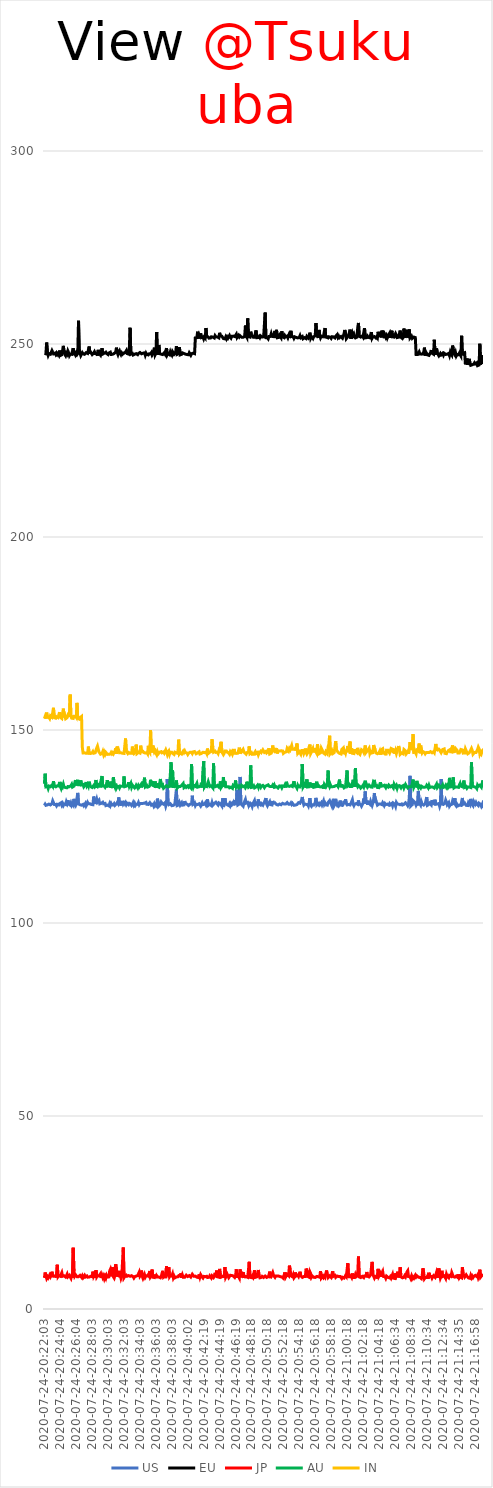
| Category | US | EU | JP | AU | IN |
|---|---|---|---|---|---|
| 2020-07-24-20:22:03 | 130.45 | 247.544 | 8.046 | 136.082 | 152.96 |
| 2020-07-24-20:22:09 | 130.794 | 247.653 | 9.466 | 138.687 | 153.498 |
| 2020-07-24-20:22:15 | 130.482 | 247.477 | 9.257 | 135.281 | 152.974 |
| 2020-07-24-20:22:21 | 130.434 | 250.376 | 7.977 | 135.175 | 154.494 |
| 2020-07-24-20:22:26 | 130.6 | 247.848 | 8.385 | 135.398 | 153.332 |
| 2020-07-24-20:22:32 | 130.545 | 247.07 | 8.054 | 134.846 | 153.342 |
| 2020-07-24-20:22:38 | 130.793 | 247.535 | 7.897 | 135.48 | 153.27 |
| 2020-07-24-20:22:43 | 130.999 | 247.503 | 8.808 | 135.39 | 152.961 |
| 2020-07-24-20:22:49 | 130.59 | 247.366 | 8.356 | 135.312 | 153.688 |
| 2020-07-24-20:22:55 | 130.654 | 247.162 | 8.757 | 135.444 | 153.873 |
| 2020-07-24-20:23:01 | 130.937 | 248.296 | 9.663 | 135.728 | 153.326 |
| 2020-07-24-20:23:07 | 131.642 | 248.53 | 8.518 | 135.416 | 153.415 |
| 2020-07-24-20:23:12 | 131.767 | 247.45 | 8.529 | 136.731 | 155.751 |
| 2020-07-24-20:23:18 | 130.731 | 247.396 | 8.461 | 135.46 | 153.223 |
| 2020-07-24-20:23:24 | 130.9 | 247.629 | 8.243 | 135.255 | 153.34 |
| 2020-07-24-20:23:29 | 130.73 | 247.267 | 8.695 | 135.271 | 153.058 |
| 2020-07-24-20:23:35 | 130.365 | 247.643 | 8.155 | 135.227 | 153.455 |
| 2020-07-24-20:23:41 | 130.744 | 247.259 | 11.451 | 135.535 | 153.559 |
| 2020-07-24-20:23:47 | 130.911 | 247.545 | 8.371 | 135.378 | 153.222 |
| 2020-07-24-20:23:52 | 130.584 | 247.187 | 8.642 | 135.515 | 153.409 |
| 2020-07-24-20:23:58 | 130.917 | 248.306 | 8.587 | 136.554 | 154.625 |
| 2020-07-24-20:24:04 | 130.674 | 247.009 | 8.482 | 135.351 | 153.306 |
| 2020-07-24-20:24:09 | 131.148 | 247.091 | 8.41 | 134.888 | 153.35 |
| 2020-07-24-20:24:15 | 130.566 | 247.195 | 9.402 | 135.666 | 152.978 |
| 2020-07-24-20:24:21 | 130.967 | 247.052 | 8.478 | 135.29 | 153.183 |
| 2020-07-24-20:24:27 | 130.459 | 249.525 | 8.388 | 135.946 | 155.537 |
| 2020-07-24-20:24:32 | 130.834 | 247.858 | 8.593 | 135.222 | 153.277 |
| 2020-07-24-20:24:38 | 131.012 | 247.293 | 8.628 | 135.447 | 153.751 |
| 2020-07-24-20:24:44 | 130.687 | 246.969 | 8.278 | 135.074 | 152.912 |
| 2020-07-24-20:24:49 | 131.462 | 247.597 | 8.588 | 135.202 | 153.109 |
| 2020-07-24-20:24:55 | 131.015 | 247.326 | 9.019 | 135.045 | 153.197 |
| 2020-07-24-20:25:01 | 131.812 | 248.2 | 8.337 | 135.35 | 153.228 |
| 2020-07-24-20:25:07 | 130.837 | 247.76 | 8.472 | 135.342 | 154.475 |
| 2020-07-24-20:25:12 | 131.079 | 247.012 | 8.739 | 135.314 | 153.372 |
| 2020-07-24-20:25:18 | 130.542 | 247.362 | 8.322 | 135.529 | 159.164 |
| 2020-07-24-20:25:24 | 131.096 | 247.171 | 7.972 | 135.574 | 153.476 |
| 2020-07-24-20:25:29 | 130.529 | 247.318 | 8.915 | 135.913 | 153.063 |
| 2020-07-24-20:25:35 | 130.935 | 247.474 | 8.077 | 135.211 | 152.885 |
| 2020-07-24-20:25:41 | 130.612 | 248.923 | 15.854 | 135.371 | 152.992 |
| 2020-07-24-20:25:47 | 132.159 | 247.101 | 9.749 | 135.457 | 153.55 |
| 2020-07-24-20:25:52 | 130.658 | 247.69 | 8.555 | 135.486 | 153.359 |
| 2020-07-24-20:25:58 | 130.386 | 247.212 | 8.889 | 137.017 | 153.585 |
| 2020-07-24-20:26:04 | 130.875 | 247.636 | 8.98 | 135.625 | 153.291 |
| 2020-07-24-20:26:09 | 130.653 | 247.26 | 8.366 | 135.737 | 157.026 |
| 2020-07-24-20:26:15 | 133.706 | 247.562 | 8.559 | 137.086 | 153.013 |
| 2020-07-24-20:26:21 | 130.823 | 256.018 | 8.378 | 135.812 | 153.148 |
| 2020-07-24-20:26:27 | 130.83 | 247.353 | 8.469 | 135.624 | 152.823 |
| 2020-07-24-20:26:32 | 130.633 | 247.714 | 8.706 | 135.813 | 153.206 |
| 2020-07-24-20:26:38 | 130.764 | 247.01 | 8.484 | 136.954 | 153.221 |
| 2020-07-24-20:26:44 | 130.527 | 247.227 | 8.214 | 135.779 | 153.518 |
| 2020-07-24-20:26:49 | 130.766 | 247.754 | 8.607 | 135.649 | 145.563 |
| 2020-07-24-20:26:55 | 130.734 | 247.466 | 8.118 | 135.87 | 144.061 |
| 2020-07-24-20:27:01 | 130.372 | 247.337 | 8.273 | 135.279 | 143.956 |
| 2020-07-24-20:27:06 | 130.569 | 247.334 | 8.718 | 135.334 | 144.096 |
| 2020-07-24-20:27:12 | 130.977 | 247.381 | 8.304 | 135.767 | 144.252 |
| 2020-07-24-20:27:18 | 130.338 | 247.734 | 8.454 | 136.522 | 143.958 |
| 2020-07-24-20:27:24 | 130.693 | 247.701 | 8.561 | 135.595 | 144.135 |
| 2020-07-24-20:27:29 | 131.234 | 247.552 | 8.254 | 135.957 | 144.004 |
| 2020-07-24-20:27:35 | 130.869 | 247.59 | 8.4 | 135.492 | 145.704 |
| 2020-07-24-20:27:41 | 130.805 | 249.348 | 8.263 | 136.608 | 143.969 |
| 2020-07-24-20:27:46 | 130.89 | 247.447 | 8.296 | 135.796 | 144.058 |
| 2020-07-24-20:27:52 | 130.997 | 247.902 | 8.483 | 135.345 | 143.904 |
| 2020-07-24-20:27:58 | 130.706 | 247.673 | 8.589 | 135.414 | 144.125 |
| 2020-07-24-20:28:03 | 130.919 | 247.275 | 8.374 | 135.111 | 144.097 |
| 2020-07-24-20:28:09 | 130.644 | 247.337 | 9.681 | 135.353 | 144.425 |
| 2020-07-24-20:28:15 | 132.769 | 247.662 | 8.439 | 135.629 | 143.985 |
| 2020-07-24-20:28:21 | 131.916 | 247.994 | 8.822 | 135.287 | 144.048 |
| 2020-07-24-20:28:26 | 130.849 | 247.512 | 8.053 | 135.58 | 144.1 |
| 2020-07-24-20:28:32 | 131.104 | 247.584 | 10.041 | 137.052 | 144.336 |
| 2020-07-24-20:28:38 | 132.117 | 247.466 | 8.331 | 134.958 | 145.364 |
| 2020-07-24-20:28:43 | 131.317 | 246.984 | 8.668 | 135.479 | 145.833 |
| 2020-07-24-20:28:49 | 131.347 | 248.48 | 8.461 | 135.884 | 146.029 |
| 2020-07-24-20:28:55 | 131.803 | 247.603 | 8.554 | 135.631 | 144.302 |
| 2020-07-24-20:29:00 | 130.863 | 247.351 | 8.486 | 136.072 | 144.062 |
| 2020-07-24-20:29:06 | 130.654 | 247.106 | 9.129 | 135.137 | 143.734 |
| 2020-07-24-20:29:12 | 130.999 | 247.194 | 8.033 | 137.17 | 143.98 |
| 2020-07-24-20:29:18 | 131.162 | 248.906 | 8.696 | 138.084 | 143.92 |
| 2020-07-24-20:29:23 | 131.283 | 247.406 | 8.149 | 135.465 | 144.425 |
| 2020-07-24-20:29:29 | 130.893 | 247.589 | 8.567 | 135.346 | 143.671 |
| 2020-07-24-20:29:35 | 130.773 | 247.623 | 7.876 | 135.459 | 144.221 |
| 2020-07-24-20:29:40 | 130.988 | 247.602 | 8.437 | 135.173 | 143.703 |
| 2020-07-24-20:29:46 | 130.407 | 247.889 | 7.982 | 135.561 | 144.2 |
| 2020-07-24-20:29:52 | 130.491 | 247.543 | 8.681 | 135.101 | 144.126 |
| 2020-07-24-20:29:58 | 130.541 | 247.545 | 8.269 | 137.007 | 143.684 |
| 2020-07-24-20:30:03 | 130.641 | 247.261 | 8.159 | 135.526 | 143.854 |
| 2020-07-24-20:30:09 | 130.342 | 247.662 | 8.312 | 135.546 | 143.699 |
| 2020-07-24-20:30:15 | 130.908 | 247.772 | 9.824 | 135.448 | 143.788 |
| 2020-07-24-20:30:20 | 130.438 | 247.878 | 10.272 | 136.63 | 143.787 |
| 2020-07-24-20:30:26 | 130.954 | 247.288 | 9.27 | 135.019 | 144.168 |
| 2020-07-24-20:30:32 | 130.601 | 247.136 | 8.47 | 135.482 | 143.845 |
| 2020-07-24-20:30:37 | 130.469 | 247.334 | 10.892 | 134.991 | 144.111 |
| 2020-07-24-20:30:43 | 130.595 | 247.156 | 8.333 | 137.753 | 143.804 |
| 2020-07-24-20:30:49 | 130.895 | 247.559 | 8.022 | 135.814 | 144.154 |
| 2020-07-24-20:30:55 | 130.475 | 247.581 | 8.791 | 135.296 | 144.467 |
| 2020-07-24-20:31:00 | 130.364 | 247.915 | 11.63 | 136.104 | 145.269 |
| 2020-07-24-20:31:06 | 130.89 | 249.051 | 10.338 | 134.951 | 143.8 |
| 2020-07-24-20:31:12 | 131.193 | 247.809 | 8.377 | 135.336 | 145.71 |
| 2020-07-24-20:31:17 | 130.921 | 247.28 | 8.47 | 135.221 | 144.202 |
| 2020-07-24-20:31:23 | 132.555 | 247.891 | 9.881 | 135.394 | 144.728 |
| 2020-07-24-20:31:29 | 131.078 | 248.229 | 8.243 | 135.014 | 144.088 |
| 2020-07-24-20:31:34 | 130.697 | 247.611 | 8.796 | 135.488 | 143.986 |
| 2020-07-24-20:31:40 | 130.534 | 247.242 | 7.936 | 135.283 | 144.102 |
| 2020-07-24-20:31:46 | 130.734 | 247.664 | 8.485 | 135.413 | 144.096 |
| 2020-07-24-20:31:52 | 131.643 | 247.328 | 8.459 | 135.391 | 143.962 |
| 2020-07-24-20:31:57 | 130.832 | 247.208 | 15.941 | 135.404 | 143.828 |
| 2020-07-24-20:32:03 | 131.15 | 247.674 | 8.122 | 137.977 | 143.934 |
| 2020-07-24-20:32:09 | 130.859 | 247.624 | 8.439 | 135.328 | 143.967 |
| 2020-07-24-20:32:14 | 131.197 | 247.917 | 8.206 | 135.493 | 147.792 |
| 2020-07-24-20:32:20 | 130.67 | 248.261 | 8.76 | 135.447 | 144.493 |
| 2020-07-24-20:32:26 | 131.005 | 247.517 | 8.483 | 135.515 | 144.454 |
| 2020-07-24-20:32:32 | 130.938 | 247.75 | 8.414 | 135.641 | 143.912 |
| 2020-07-24-20:32:37 | 130.643 | 247.382 | 8.653 | 136.468 | 144.178 |
| 2020-07-24-20:32:43 | 130.995 | 249.034 | 8.664 | 135.416 | 144.115 |
| 2020-07-24-20:32:49 | 130.974 | 254.189 | 8.477 | 135.225 | 143.945 |
| 2020-07-24-20:32:54 | 130.805 | 247.361 | 8.455 | 136.217 | 143.762 |
| 2020-07-24-20:33:00 | 130.467 | 247.288 | 8.63 | 135.237 | 143.98 |
| 2020-07-24-20:33:06 | 130.735 | 247.568 | 8.484 | 135.732 | 145.705 |
| 2020-07-24-20:33:12 | 131.169 | 247.145 | 8.372 | 135.461 | 144.217 |
| 2020-07-24-20:33:17 | 130.582 | 247.386 | 8.036 | 135.362 | 143.878 |
| 2020-07-24-20:33:23 | 131.007 | 247.358 | 8.358 | 135.007 | 143.744 |
| 2020-07-24-20:33:29 | 130.501 | 247.594 | 8.107 | 135.28 | 144.286 |
| 2020-07-24-20:33:34 | 130.794 | 247.503 | 8.525 | 135.695 | 146.215 |
| 2020-07-24-20:33:40 | 130.894 | 247.344 | 8.312 | 135.485 | 143.884 |
| 2020-07-24-20:33:46 | 130.733 | 247.24 | 8.651 | 135.019 | 144.064 |
| 2020-07-24-20:33:51 | 131.202 | 247.543 | 8.44 | 135.586 | 144.221 |
| 2020-07-24-20:33:57 | 130.657 | 247.437 | 9.535 | 135.223 | 144.064 |
| 2020-07-24-20:34:03 | 130.964 | 247.797 | 8.486 | 135.427 | 144.019 |
| 2020-07-24-20:34:09 | 131.034 | 248.053 | 8.754 | 135.778 | 145.948 |
| 2020-07-24-20:34:14 | 130.931 | 247.463 | 9.959 | 135.116 | 144.37 |
| 2020-07-24-20:34:20 | 130.996 | 247.245 | 8.479 | 135.977 | 144.228 |
| 2020-07-24-20:34:26 | 130.983 | 247.629 | 7.945 | 136.656 | 144.454 |
| 2020-07-24-20:34:31 | 130.84 | 247.464 | 8.396 | 135.418 | 144.172 |
| 2020-07-24-20:34:37 | 131.042 | 247.712 | 8.912 | 137.637 | 144.168 |
| 2020-07-24-20:34:43 | 131.022 | 247.091 | 8.249 | 135.292 | 144.032 |
| 2020-07-24-20:34:49 | 131.23 | 247.639 | 8.608 | 135.517 | 144.266 |
| 2020-07-24-20:34:54 | 130.737 | 247.299 | 8.39 | 135.637 | 144.154 |
| 2020-07-24-20:35:00 | 130.528 | 247.479 | 8.542 | 135.213 | 143.844 |
| 2020-07-24-20:35:06 | 130.729 | 247.178 | 8.881 | 135.227 | 145.918 |
| 2020-07-24-20:35:11 | 130.824 | 247.447 | 8.55 | 135.347 | 144.45 |
| 2020-07-24-20:35:17 | 131.186 | 247.448 | 9.867 | 135.629 | 144.167 |
| 2020-07-24-20:35:23 | 130.925 | 247.474 | 8.368 | 137.098 | 149.918 |
| 2020-07-24-20:35:28 | 130.522 | 247.758 | 8.68 | 135.677 | 144.197 |
| 2020-07-24-20:35:34 | 130.77 | 247.127 | 10.228 | 136.756 | 144.288 |
| 2020-07-24-20:35:40 | 130.762 | 247.442 | 8.234 | 135.648 | 145.967 |
| 2020-07-24-20:35:46 | 130.339 | 247.209 | 8.374 | 135.534 | 145.234 |
| 2020-07-24-20:35:51 | 130.861 | 249.034 | 8.157 | 135.458 | 144.332 |
| 2020-07-24-20:35:57 | 130.382 | 247.192 | 8.939 | 136.689 | 144.617 |
| 2020-07-24-20:36:03 | 130.644 | 247.601 | 8.007 | 135.062 | 143.988 |
| 2020-07-24-20:36:08 | 130.367 | 253.116 | 8.648 | 136.215 | 143.598 |
| 2020-07-24-20:36:14 | 132.222 | 247.247 | 8.356 | 135.399 | 144.341 |
| 2020-07-24-20:36:20 | 132.001 | 248.797 | 8.503 | 135.644 | 143.796 |
| 2020-07-24-20:36:26 | 130.299 | 249.755 | 8.271 | 135.198 | 143.843 |
| 2020-07-24-20:36:31 | 130.556 | 247.49 | 8.504 | 135.155 | 144.251 |
| 2020-07-24-20:36:37 | 130.716 | 247.61 | 8.077 | 137.313 | 144.443 |
| 2020-07-24-20:36:43 | 131.336 | 247.369 | 8.398 | 135.174 | 144.387 |
| 2020-07-24-20:36:48 | 131.062 | 247.374 | 8.449 | 136.293 | 144.1 |
| 2020-07-24-20:36:54 | 131.16 | 247.268 | 9.897 | 135.426 | 144.331 |
| 2020-07-24-20:37:00 | 130.789 | 247.067 | 8.292 | 134.917 | 144.302 |
| 2020-07-24-20:37:06 | 130.75 | 247.727 | 8.518 | 134.955 | 143.999 |
| 2020-07-24-20:37:11 | 131.145 | 247.395 | 8.661 | 135.287 | 143.837 |
| 2020-07-24-20:37:17 | 130.273 | 247.597 | 7.991 | 135.264 | 144.856 |
| 2020-07-24-20:37:23 | 130.894 | 248.933 | 11.108 | 135.581 | 144.315 |
| 2020-07-24-20:37:28 | 137.302 | 247.206 | 8.502 | 135.58 | 143.672 |
| 2020-07-24-20:37:34 | 130.973 | 247.565 | 8.302 | 135.236 | 144.279 |
| 2020-07-24-20:37:40 | 130.65 | 247.65 | 10.848 | 135.037 | 144.571 |
| 2020-07-24-20:37:46 | 130.528 | 247.245 | 8.356 | 135.425 | 143.705 |
| 2020-07-24-20:37:51 | 130.906 | 247.949 | 8.639 | 135.684 | 144.256 |
| 2020-07-24-20:37:57 | 130.656 | 247.426 | 8.593 | 141.63 | 144.38 |
| 2020-07-24-20:38:03 | 130.392 | 247.118 | 8.549 | 135.186 | 144.222 |
| 2020-07-24-20:38:08 | 130.419 | 248.009 | 9.095 | 139.521 | 143.961 |
| 2020-07-24-20:38:14 | 130.479 | 247.689 | 8.091 | 135.03 | 143.894 |
| 2020-07-24-20:38:20 | 130.641 | 247.322 | 8.512 | 135.563 | 143.671 |
| 2020-07-24-20:38:25 | 130.79 | 247.193 | 8.075 | 135.906 | 144.256 |
| 2020-07-24-20:38:31 | 130.911 | 247.743 | 8.09 | 135.644 | 144.287 |
| 2020-07-24-20:38:37 | 134.582 | 249.423 | 8.291 | 136.932 | 144.085 |
| 2020-07-24-20:38:43 | 130.411 | 247.323 | 8.214 | 134.947 | 144.058 |
| 2020-07-24-20:38:48 | 130.645 | 247.179 | 8.349 | 135.065 | 143.933 |
| 2020-07-24-20:38:54 | 130.583 | 247.533 | 8.634 | 135.342 | 147.506 |
| 2020-07-24-20:39:00 | 131.162 | 249.192 | 8.71 | 135.466 | 143.844 |
| 2020-07-24-20:39:05 | 130.547 | 247.185 | 8.519 | 135.346 | 144.105 |
| 2020-07-24-20:39:11 | 130.499 | 247.321 | 9.252 | 135.176 | 143.898 |
| 2020-07-24-20:39:17 | 131.159 | 247.329 | 8.055 | 135.673 | 143.795 |
| 2020-07-24-20:39:22 | 130.527 | 247.705 | 8.786 | 135.514 | 144.232 |
| 2020-07-24-20:39:28 | 130.307 | 247.692 | 8.244 | 136.142 | 144.529 |
| 2020-07-24-20:39:34 | 130.598 | 247.531 | 8.114 | 135.094 | 144.174 |
| 2020-07-24-20:39:40 | 131.575 | 247.612 | 8.218 | 135.299 | 144.57 |
| 2020-07-24-20:39:45 | 130.943 | 247.376 | 8.228 | 135.447 | 144.157 |
| 2020-07-24-20:39:51 | 130.787 | 247.57 | 8.758 | 135.155 | 144.022 |
| 2020-07-24-20:39:57 | 130.801 | 247.265 | 8.53 | 135.165 | 144.031 |
| 2020-07-24-20:40:02 | 130.773 | 247.491 | 8.414 | 135.516 | 143.663 |
| 2020-07-24-20:40:08 | 130.449 | 247.221 | 8.328 | 135.223 | 143.968 |
| 2020-07-24-20:40:14 | 130.699 | 247.726 | 8.652 | 135.493 | 143.899 |
| 2020-07-24-20:40:20 | 130.789 | 247.5 | 8.756 | 135.386 | 144.227 |
| 2020-07-24-20:40:25 | 130.891 | 247.077 | 8.285 | 135.037 | 144.233 |
| 2020-07-24-20:40:31 | 130.805 | 247.49 | 8.166 | 141.168 | 144.231 |
| 2020-07-24-20:40:53 | 132.981 | 247.693 | 9.004 | 135.607 | 143.905 |
| 2020-07-24-20:40:59 | 130.792 | 247.623 | 8.896 | 135.083 | 144.325 |
| 2020-07-24-20:41:05 | 130.728 | 247.655 | 8.493 | 135.661 | 144.168 |
| 2020-07-24-20:41:10 | 131.143 | 247.496 | 8.417 | 135.452 | 144.421 |
| 2020-07-24-20:41:16 | 130.435 | 251.581 | 8.519 | 135.419 | 144.15 |
| 2020-07-24-20:41:22 | 130.797 | 251.611 | 8.34 | 135.262 | 143.839 |
| 2020-07-24-20:41:28 | 130.927 | 251.637 | 8.241 | 136.182 | 143.875 |
| 2020-07-24-20:41:33 | 130.682 | 253.19 | 8.356 | 135.193 | 144.084 |
| 2020-07-24-20:41:39 | 130.743 | 251.439 | 8.159 | 134.986 | 143.913 |
| 2020-07-24-20:41:45 | 130.883 | 252.236 | 8.973 | 135.298 | 144.364 |
| 2020-07-24-20:41:50 | 130.851 | 251.66 | 8.243 | 135.101 | 143.78 |
| 2020-07-24-20:41:56 | 130.307 | 252.733 | 8.891 | 135.481 | 143.628 |
| 2020-07-24-20:42:02 | 130.363 | 251.664 | 8.54 | 136.337 | 143.921 |
| 2020-07-24-20:42:08 | 131.136 | 251.64 | 8.513 | 135.115 | 144.094 |
| 2020-07-24-20:42:13 | 130.67 | 251.833 | 8.047 | 135.21 | 144.237 |
| 2020-07-24-20:42:19 | 130.532 | 251.325 | 8.448 | 141.913 | 144.029 |
| 2020-07-24-20:42:25 | 130.776 | 251.835 | 8.246 | 135.224 | 144.144 |
| 2020-07-24-20:42:30 | 131.073 | 251.571 | 8.367 | 135.538 | 143.905 |
| 2020-07-24-20:42:36 | 130.653 | 254.147 | 8.344 | 135.326 | 144.289 |
| 2020-07-24-20:42:42 | 130.775 | 251.981 | 8.466 | 135.362 | 143.885 |
| 2020-07-24-20:42:47 | 132.045 | 251.947 | 8.154 | 135.543 | 145.194 |
| 2020-07-24-20:42:53 | 130.471 | 251.8 | 8.409 | 136.617 | 143.917 |
| 2020-07-24-20:42:59 | 130.616 | 251.517 | 8.224 | 135.982 | 143.942 |
| 2020-07-24-20:43:05 | 130.757 | 251.473 | 8.592 | 135.365 | 144.242 |
| 2020-07-24-20:43:10 | 130.895 | 251.556 | 8.362 | 135.168 | 144.086 |
| 2020-07-24-20:43:16 | 130.433 | 251.861 | 8.049 | 135.535 | 144.463 |
| 2020-07-24-20:43:22 | 131.187 | 251.629 | 8.58 | 135.541 | 147.6 |
| 2020-07-24-20:43:27 | 130.522 | 251.78 | 8.559 | 135.033 | 145.419 |
| 2020-07-24-20:43:33 | 130.562 | 251.637 | 8.123 | 141.357 | 144.264 |
| 2020-07-24-20:43:39 | 130.961 | 251.557 | 8.413 | 135.242 | 144.302 |
| 2020-07-24-20:43:45 | 131.025 | 252.153 | 9.349 | 135.391 | 144.517 |
| 2020-07-24-20:43:50 | 131.287 | 251.868 | 8.264 | 135.364 | 144.204 |
| 2020-07-24-20:43:56 | 131.001 | 251.891 | 9.947 | 135.38 | 144.337 |
| 2020-07-24-20:44:02 | 130.776 | 251.82 | 8.349 | 135.634 | 144.216 |
| 2020-07-24-20:44:07 | 130.571 | 251.737 | 8.248 | 135.423 | 143.902 |
| 2020-07-24-20:44:13 | 131.122 | 251.594 | 8.241 | 135.214 | 144.593 |
| 2020-07-24-20:44:19 | 130.956 | 252.901 | 10.394 | 135.698 | 144.094 |
| 2020-07-24-20:44:24 | 130.884 | 252.061 | 8.723 | 136.696 | 143.843 |
| 2020-07-24-20:44:30 | 130.938 | 251.863 | 8.251 | 135.104 | 146.935 |
| 2020-07-24-20:44:36 | 130.297 | 252.008 | 8.337 | 135.295 | 144.3 |
| 2020-07-24-20:44:42 | 132.313 | 251.895 | 8.447 | 135.706 | 143.973 |
| 2020-07-24-20:44:47 | 130.093 | 251.401 | 8.27 | 137.826 | 143.624 |
| 2020-07-24-20:44:53 | 130.701 | 251.563 | 8.372 | 135.226 | 143.968 |
| 2020-07-24-20:44:59 | 132.356 | 251.327 | 10.881 | 136.693 | 144.573 |
| 2020-07-24-20:45:04 | 131.073 | 251.806 | 8.198 | 135.314 | 144.727 |
| 2020-07-24-20:45:10 | 130.895 | 251.362 | 8.571 | 135.388 | 144.551 |
| 2020-07-24-20:45:16 | 130.624 | 251.823 | 9.003 | 135.301 | 144.256 |
| 2020-07-24-20:45:22 | 130.737 | 251.52 | 9.135 | 135.546 | 144.162 |
| 2020-07-24-20:45:27 | 130.417 | 251.552 | 8.114 | 135.296 | 144.022 |
| 2020-07-24-20:45:33 | 130.863 | 252.21 | 8.22 | 135.023 | 143.735 |
| 2020-07-24-20:45:39 | 130.416 | 251.782 | 8.726 | 134.909 | 144.366 |
| 2020-07-24-20:45:44 | 130.943 | 251.521 | 8.513 | 135.202 | 144.041 |
| 2020-07-24-20:45:50 | 130.638 | 251.993 | 8.697 | 135.09 | 144.345 |
| 2020-07-24-20:45:56 | 130.733 | 251.839 | 8.448 | 134.889 | 143.765 |
| 2020-07-24-20:46:01 | 131.257 | 252.045 | 8.564 | 135.713 | 144.276 |
| 2020-07-24-20:46:07 | 130.472 | 251.879 | 8.339 | 135.888 | 145.093 |
| 2020-07-24-20:46:13 | 131.852 | 251.922 | 8.177 | 135.446 | 143.949 |
| 2020-07-24-20:46:19 | 131.903 | 252.115 | 8.541 | 136.932 | 143.869 |
| 2020-07-24-20:46:24 | 130.719 | 252.534 | 10.291 | 135.242 | 143.941 |
| 2020-07-24-20:46:30 | 134.531 | 251.673 | 8.105 | 135.521 | 144.056 |
| 2020-07-24-20:46:36 | 130.583 | 251.724 | 8.729 | 135.318 | 143.999 |
| 2020-07-24-20:46:41 | 130.595 | 252.234 | 8.684 | 135.035 | 143.976 |
| 2020-07-24-20:46:47 | 130.846 | 251.852 | 8.005 | 135.523 | 145.422 |
| 2020-07-24-20:46:53 | 137.85 | 252.127 | 10.267 | 135.589 | 143.898 |
| 2020-07-24-20:46:59 | 131.033 | 252.011 | 8.329 | 135.253 | 144.659 |
| 2020-07-24-20:47:04 | 130.664 | 251.752 | 9.639 | 135.675 | 144.364 |
| 2020-07-24-20:47:10 | 130.824 | 251.608 | 8.189 | 135.481 | 144.48 |
| 2020-07-24-20:47:16 | 130.255 | 251.751 | 9.529 | 135.315 | 144.962 |
| 2020-07-24-20:47:21 | 131.025 | 251.737 | 8.032 | 135.465 | 144.383 |
| 2020-07-24-20:47:27 | 130.97 | 251.932 | 8.552 | 135.529 | 144.088 |
| 2020-07-24-20:47:33 | 132.002 | 254.771 | 8.391 | 135.089 | 143.973 |
| 2020-07-24-20:47:38 | 131.068 | 252.064 | 8.377 | 135.46 | 143.74 |
| 2020-07-24-20:47:44 | 131.02 | 251.702 | 8.334 | 136.603 | 144.146 |
| 2020-07-24-20:47:50 | 131.231 | 256.642 | 8.207 | 135.624 | 144.02 |
| 2020-07-24-20:47:56 | 130.643 | 251.953 | 10.106 | 135.146 | 144.329 |
| 2020-07-24-20:48:01 | 131.394 | 251.873 | 12.222 | 135.304 | 145.757 |
| 2020-07-24-20:48:07 | 130.512 | 251.811 | 8.215 | 135.462 | 143.847 |
| 2020-07-24-20:48:13 | 130.596 | 253.182 | 8.298 | 140.835 | 143.96 |
| 2020-07-24-20:48:18 | 130.811 | 252.379 | 8.134 | 135.131 | 144.141 |
| 2020-07-24-20:48:24 | 130.217 | 252.214 | 8.529 | 135.146 | 143.692 |
| 2020-07-24-20:48:30 | 130.872 | 251.778 | 8.224 | 135.205 | 143.7 |
| 2020-07-24-20:48:36 | 130.717 | 251.928 | 8.157 | 135.496 | 143.712 |
| 2020-07-24-20:48:41 | 131.697 | 251.762 | 10.025 | 134.999 | 144.097 |
| 2020-07-24-20:48:47 | 130.705 | 252.009 | 8.199 | 135.226 | 144.399 |
| 2020-07-24-20:48:53 | 130.895 | 253.516 | 8.012 | 135.221 | 143.905 |
| 2020-07-24-20:48:58 | 131.063 | 251.632 | 8.317 | 135.262 | 144.002 |
| 2020-07-24-20:49:04 | 130.649 | 251.627 | 8.676 | 135.705 | 144.187 |
| 2020-07-24-20:49:10 | 132.024 | 251.675 | 10.109 | 135.227 | 143.574 |
| 2020-07-24-20:49:15 | 130.819 | 251.949 | 8.6 | 136.077 | 144.066 |
| 2020-07-24-20:49:21 | 130.814 | 251.642 | 8.081 | 135.353 | 143.879 |
| 2020-07-24-20:49:27 | 130.564 | 252.105 | 8.053 | 135.087 | 144.477 |
| 2020-07-24-20:49:33 | 130.956 | 251.883 | 8.193 | 135.451 | 144.203 |
| 2020-07-24-20:49:38 | 130.731 | 251.799 | 8.459 | 135.54 | 143.971 |
| 2020-07-24-20:49:44 | 130.544 | 251.861 | 8.279 | 135.64 | 144.859 |
| 2020-07-24-20:49:50 | 131.012 | 251.862 | 8.166 | 135.376 | 144.903 |
| 2020-07-24-20:49:55 | 131.285 | 252.062 | 8.425 | 135.08 | 144.188 |
| 2020-07-24-20:50:01 | 131.21 | 258.135 | 8.551 | 135.42 | 144.284 |
| 2020-07-24-20:50:07 | 132.357 | 251.643 | 8.753 | 135.305 | 144.467 |
| 2020-07-24-20:50:13 | 130.782 | 251.636 | 8.177 | 135.595 | 144.07 |
| 2020-07-24-20:50:18 | 130.374 | 251.62 | 8.301 | 135.795 | 144.234 |
| 2020-07-24-20:50:24 | 130.812 | 251.352 | 8.349 | 135.785 | 144.461 |
| 2020-07-24-20:50:30 | 130.935 | 251.97 | 8.751 | 135.482 | 145.301 |
| 2020-07-24-20:50:35 | 131.445 | 251.876 | 9.691 | 135.439 | 143.78 |
| 2020-07-24-20:50:41 | 130.674 | 251.974 | 7.994 | 135.336 | 143.976 |
| 2020-07-24-20:50:47 | 130.727 | 252.66 | 8.544 | 135.308 | 143.972 |
| 2020-07-24-20:50:53 | 130.581 | 251.97 | 8.379 | 135.368 | 144.381 |
| 2020-07-24-20:50:58 | 131.617 | 252.201 | 9.455 | 135.718 | 145.987 |
| 2020-07-24-20:51:04 | 131.028 | 251.917 | 8.789 | 135.398 | 144.267 |
| 2020-07-24-20:51:10 | 131.001 | 251.805 | 8.474 | 135.762 | 144.168 |
| 2020-07-24-20:51:15 | 131.124 | 253.404 | 8.207 | 135.192 | 145.349 |
| 2020-07-24-20:51:21 | 131.011 | 251.575 | 8.546 | 135.321 | 144.037 |
| 2020-07-24-20:51:27 | 130.701 | 253.667 | 8.38 | 135.317 | 145.299 |
| 2020-07-24-20:51:32 | 130.844 | 251.62 | 8.548 | 135.57 | 143.926 |
| 2020-07-24-20:51:38 | 130.56 | 251.771 | 8.592 | 134.974 | 144.6 |
| 2020-07-24-20:51:44 | 130.671 | 251.697 | 8.523 | 135.057 | 144.428 |
| 2020-07-24-20:51:50 | 130.821 | 252.257 | 8.549 | 135.522 | 144.546 |
| 2020-07-24-20:51:55 | 130.677 | 252.022 | 8.381 | 135.564 | 144.504 |
| 2020-07-24-20:52:01 | 130.639 | 251.64 | 8.22 | 135.467 | 144.607 |
| 2020-07-24-20:52:07 | 130.828 | 253.304 | 8.305 | 135.049 | 144.468 |
| 2020-07-24-20:52:12 | 131.005 | 251.858 | 8.343 | 135.51 | 144.582 |
| 2020-07-24-20:52:18 | 130.874 | 251.973 | 7.958 | 135.517 | 143.929 |
| 2020-07-24-20:52:24 | 130.822 | 251.645 | 8.046 | 135.401 | 143.864 |
| 2020-07-24-20:52:30 | 130.638 | 252.17 | 9.488 | 135.721 | 144.254 |
| 2020-07-24-20:52:35 | 130.807 | 251.842 | 8.264 | 135.1 | 144.486 |
| 2020-07-24-20:52:41 | 130.695 | 251.675 | 8.088 | 136.576 | 144.347 |
| 2020-07-24-20:52:47 | 131.205 | 252.056 | 8.976 | 135.823 | 145.231 |
| 2020-07-24-20:52:52 | 131.24 | 251.617 | 8.743 | 135.494 | 144.983 |
| 2020-07-24-20:52:58 | 130.765 | 252.166 | 8.603 | 135.383 | 144.592 |
| 2020-07-24-20:53:04 | 130.555 | 251.548 | 11.238 | 135.391 | 145.205 |
| 2020-07-24-20:53:09 | 130.793 | 251.791 | 10.209 | 135.584 | 144.882 |
| 2020-07-24-20:53:15 | 131.099 | 253.411 | 8.594 | 135.571 | 145.022 |
| 2020-07-24-20:53:21 | 130.725 | 251.911 | 8.671 | 135.335 | 145.973 |
| 2020-07-24-20:53:27 | 131.016 | 252.095 | 8.346 | 135.354 | 145.009 |
| 2020-07-24-20:53:32 | 130.934 | 251.9 | 8.867 | 135.103 | 144.992 |
| 2020-07-24-20:53:38 | 130.489 | 251.471 | 8.08 | 136.729 | 144.985 |
| 2020-07-24-20:53:44 | 130.718 | 251.845 | 8.365 | 135.538 | 144.978 |
| 2020-07-24-20:53:49 | 130.545 | 251.795 | 9.472 | 135.331 | 145.34 |
| 2020-07-24-20:53:55 | 130.375 | 251.683 | 8.567 | 135.299 | 144.666 |
| 2020-07-24-20:54:01 | 130.692 | 251.74 | 8.481 | 134.931 | 146.496 |
| 2020-07-24-20:54:07 | 130.674 | 251.575 | 8.746 | 135.666 | 143.938 |
| 2020-07-24-20:54:12 | 131.177 | 251.604 | 8.433 | 135.285 | 143.954 |
| 2020-07-24-20:54:18 | 130.986 | 251.725 | 8.223 | 135.439 | 144.395 |
| 2020-07-24-20:54:24 | 131.038 | 252.178 | 9.657 | 135.247 | 144.182 |
| 2020-07-24-20:54:29 | 131.159 | 251.621 | 8.582 | 135.722 | 143.723 |
| 2020-07-24-20:54:35 | 131.842 | 251.838 | 8.614 | 135.342 | 144.667 |
| 2020-07-24-20:54:41 | 132.644 | 251.926 | 8.186 | 141.192 | 144.779 |
| 2020-07-24-20:54:47 | 131.279 | 251.361 | 8.101 | 135.228 | 144.699 |
| 2020-07-24-20:54:52 | 130.601 | 251.436 | 8.4 | 135.38 | 143.937 |
| 2020-07-24-20:54:58 | 130.873 | 251.638 | 8.362 | 135.922 | 144.39 |
| 2020-07-24-20:55:04 | 130.877 | 251.697 | 8.423 | 136.496 | 145.208 |
| 2020-07-24-20:55:09 | 130.731 | 251.405 | 10.474 | 135.054 | 144.174 |
| 2020-07-24-20:55:15 | 130.693 | 252.002 | 10.016 | 137.186 | 143.75 |
| 2020-07-24-20:55:21 | 130.685 | 252.114 | 8.444 | 135.231 | 144.07 |
| 2020-07-24-20:55:26 | 130.304 | 251.54 | 8.353 | 135.414 | 144.934 |
| 2020-07-24-20:55:32 | 131.135 | 251.892 | 8.234 | 135.292 | 144.686 |
| 2020-07-24-20:55:38 | 132.36 | 252.938 | 9.638 | 136.403 | 146.232 |
| 2020-07-24-20:55:44 | 130.514 | 251.494 | 9.215 | 135.206 | 143.889 |
| 2020-07-24-20:55:49 | 130.252 | 251.897 | 8.236 | 136.129 | 144.28 |
| 2020-07-24-20:55:55 | 130.639 | 251.647 | 8.569 | 135.123 | 144.353 |
| 2020-07-24-20:56:01 | 130.563 | 251.418 | 8.722 | 136.205 | 145.184 |
| 2020-07-24-20:56:07 | 130.535 | 251.899 | 8.232 | 135.158 | 144.196 |
| 2020-07-24-20:56:12 | 130.706 | 251.78 | 8.116 | 135.097 | 145.298 |
| 2020-07-24-20:56:18 | 131.154 | 252.103 | 8.165 | 135.261 | 144.73 |
| 2020-07-24-20:56:24 | 132.415 | 255.435 | 8.291 | 135.425 | 144.797 |
| 2020-07-24-20:56:29 | 130.712 | 251.987 | 8.437 | 136.609 | 143.97 |
| 2020-07-24-20:56:35 | 130.979 | 252.606 | 8.273 | 135.078 | 146.354 |
| 2020-07-24-20:56:41 | 130.681 | 251.559 | 8.363 | 135.664 | 144.219 |
| 2020-07-24-20:56:46 | 130.947 | 253.649 | 8.359 | 135.535 | 143.832 |
| 2020-07-24-20:56:52 | 130.598 | 252.277 | 8.23 | 135.282 | 144.018 |
| 2020-07-24-20:56:58 | 130.694 | 251.62 | 9.83 | 135.492 | 144.104 |
| 2020-07-24-20:57:04 | 131.156 | 252.015 | 8.028 | 135.244 | 145.282 |
| 2020-07-24-20:57:09 | 130.638 | 252.06 | 8.179 | 135.39 | 144.888 |
| 2020-07-24-20:57:15 | 130.466 | 251.873 | 8.556 | 135.508 | 144.947 |
| 2020-07-24-20:57:21 | 131.619 | 252.166 | 8.172 | 134.815 | 144.026 |
| 2020-07-24-20:57:26 | 130.71 | 251.98 | 8.519 | 135.851 | 144.047 |
| 2020-07-24-20:57:32 | 131.035 | 254.132 | 8.223 | 135.491 | 143.743 |
| 2020-07-24-20:57:38 | 130.592 | 251.495 | 8.28 | 135.207 | 144.381 |
| 2020-07-24-20:57:44 | 130.538 | 251.935 | 9.976 | 135.52 | 144.295 |
| 2020-07-24-20:57:49 | 130.526 | 251.79 | 8.79 | 136.337 | 143.863 |
| 2020-07-24-20:57:55 | 131.246 | 251.603 | 8.126 | 139.492 | 145.662 |
| 2020-07-24-20:58:01 | 131.347 | 251.866 | 8.29 | 135.769 | 146.38 |
| 2020-07-24-20:58:06 | 131.71 | 251.913 | 8.583 | 135.297 | 148.529 |
| 2020-07-24-20:58:12 | 131.218 | 251.738 | 8.474 | 135.786 | 143.937 |
| 2020-07-24-20:58:18 | 130.818 | 251.477 | 8.199 | 135.297 | 144.208 |
| 2020-07-24-20:58:24 | 130.343 | 251.891 | 8.215 | 135.495 | 144.584 |
| 2020-07-24-20:58:29 | 131.389 | 251.799 | 9.766 | 135.311 | 143.87 |
| 2020-07-24-20:58:35 | 132.171 | 251.849 | 8.471 | 135.184 | 143.892 |
| 2020-07-24-20:58:41 | 130.407 | 251.661 | 8.284 | 135.359 | 144.124 |
| 2020-07-24-20:58:46 | 130.796 | 251.583 | 8.693 | 135.616 | 144.38 |
| 2020-07-24-20:58:52 | 132.168 | 251.999 | 8.184 | 135.584 | 147.124 |
| 2020-07-24-20:58:58 | 130.781 | 251.825 | 8.064 | 135.336 | 144.835 |
| 2020-07-24-20:59:04 | 130.473 | 252.442 | 8.539 | 135.659 | 144.573 |
| 2020-07-24-20:59:09 | 130.749 | 251.724 | 8.557 | 135.367 | 144.26 |
| 2020-07-24-20:59:15 | 130.392 | 252.02 | 8.414 | 135.318 | 144.319 |
| 2020-07-24-20:59:21 | 130.719 | 251.616 | 8.601 | 137.148 | 143.948 |
| 2020-07-24-20:59:26 | 131.713 | 251.664 | 8.419 | 135.187 | 143.78 |
| 2020-07-24-20:59:32 | 130.54 | 251.934 | 8.496 | 135.638 | 143.796 |
| 2020-07-24-20:59:38 | 130.778 | 251.72 | 7.889 | 135.563 | 144.929 |
| 2020-07-24-20:59:44 | 130.457 | 251.506 | 8.198 | 135.627 | 145.019 |
| 2020-07-24-20:59:49 | 130.753 | 251.988 | 7.971 | 135.314 | 145.32 |
| 2020-07-24-20:59:55 | 131.619 | 252.689 | 7.998 | 135.015 | 143.722 |
| 2020-07-24-21:00:01 | 130.924 | 253.637 | 8.285 | 134.901 | 144.495 |
| 2020-07-24-21:00:06 | 132.085 | 252.844 | 8.662 | 135.332 | 144.001 |
| 2020-07-24-21:00:12 | 130.937 | 251.383 | 8.393 | 135.498 | 144.885 |
| 2020-07-24-21:00:18 | 130.593 | 251.644 | 8.65 | 139.523 | 144.236 |
| 2020-07-24-21:00:24 | 130.532 | 251.583 | 11.879 | 135.502 | 145.843 |
| 2020-07-24-21:00:29 | 130.704 | 252.15 | 8.376 | 135.502 | 145.233 |
| 2020-07-24-21:00:35 | 130.822 | 252.057 | 8.222 | 135.826 | 145.036 |
| 2020-07-24-21:00:41 | 130.594 | 253.724 | 8.348 | 135.364 | 147.032 |
| 2020-07-24-21:00:46 | 130.969 | 251.362 | 8.618 | 135.565 | 143.814 |
| 2020-07-24-21:00:52 | 130.848 | 251.596 | 8.233 | 135.378 | 145.236 |
| 2020-07-24-21:00:58 | 131.943 | 252.813 | 9.212 | 135.387 | 143.975 |
| 2020-07-24-21:01:03 | 130.829 | 252.188 | 8.132 | 137.113 | 144.194 |
| 2020-07-24-21:01:09 | 130.405 | 252.547 | 8.069 | 136.868 | 143.89 |
| 2020-07-24-21:01:15 | 130.822 | 251.847 | 8.184 | 135.245 | 145.01 |
| 2020-07-24-21:01:21 | 130.613 | 251.586 | 8.892 | 140.075 | 144.448 |
| 2020-07-24-21:01:26 | 130.949 | 251.752 | 8.366 | 135.334 | 144.656 |
| 2020-07-24-21:01:32 | 131.169 | 251.769 | 8.603 | 135.744 | 144.121 |
| 2020-07-24-21:01:38 | 130.738 | 254.152 | 8.729 | 135.332 | 145.379 |
| 2020-07-24-21:01:43 | 131.767 | 255.459 | 13.593 | 135.657 | 144.119 |
| 2020-07-24-21:01:49 | 130.752 | 251.982 | 8.315 | 135.459 | 144.129 |
| 2020-07-24-21:01:55 | 130.836 | 251.799 | 8.475 | 135.306 | 143.68 |
| 2020-07-24-21:02:01 | 130.662 | 251.783 | 8.135 | 134.959 | 143.866 |
| 2020-07-24-21:02:06 | 130.266 | 251.8 | 8.227 | 135.003 | 144.899 |
| 2020-07-24-21:02:12 | 130.41 | 252.096 | 8.463 | 135.351 | 144.863 |
| 2020-07-24-21:02:18 | 131.077 | 251.799 | 8.407 | 135.66 | 144.584 |
| 2020-07-24-21:02:23 | 132.249 | 251.648 | 8.129 | 135.271 | 144.181 |
| 2020-07-24-21:02:29 | 130.98 | 254.107 | 8.554 | 135.157 | 144.143 |
| 2020-07-24-21:02:35 | 134.07 | 251.591 | 8.345 | 136.871 | 145.992 |
| 2020-07-24-21:02:40 | 131.007 | 251.627 | 8.52 | 135.163 | 144.189 |
| 2020-07-24-21:02:46 | 131.66 | 251.658 | 9.587 | 135.714 | 144.194 |
| 2020-07-24-21:02:52 | 130.66 | 252.028 | 8.492 | 135.201 | 144.695 |
| 2020-07-24-21:02:58 | 131.235 | 251.73 | 8.372 | 135.294 | 144.885 |
| 2020-07-24-21:03:03 | 131.114 | 251.552 | 8.308 | 135.725 | 145.283 |
| 2020-07-24-21:03:09 | 130.802 | 251.611 | 8.481 | 135.543 | 143.942 |
| 2020-07-24-21:03:15 | 131.519 | 251.81 | 8.837 | 135.259 | 144.413 |
| 2020-07-24-21:03:20 | 130.952 | 253.081 | 8.737 | 135.483 | 144.007 |
| 2020-07-24-21:03:26 | 130.451 | 251.513 | 12.209 | 135.196 | 143.937 |
| 2020-07-24-21:03:32 | 131.059 | 251.878 | 9.043 | 135.979 | 144.133 |
| 2020-07-24-21:03:38 | 132.025 | 251.709 | 8.502 | 135.295 | 146.102 |
| 2020-07-24-21:03:43 | 133.673 | 251.919 | 8.04 | 137.071 | 146.061 |
| 2020-07-24-21:03:49 | 131.176 | 252.006 | 8.469 | 135.512 | 144.855 |
| 2020-07-24-21:03:55 | 131.79 | 251.56 | 8.518 | 135.265 | 144.069 |
| 2020-07-24-21:04:00 | 131.123 | 251.856 | 8.527 | 135.642 | 144.103 |
| 2020-07-24-21:04:06 | 130.535 | 251.573 | 7.846 | 135.112 | 143.855 |
| 2020-07-24-21:04:12 | 130.593 | 253.165 | 10.396 | 135.124 | 143.964 |
| 2020-07-24-21:04:18 | 130.837 | 251.861 | 8.515 | 135.068 | 144.058 |
| 2020-07-24-21:04:23 | 130.645 | 251.834 | 8.261 | 135.819 | 144.501 |
| 2020-07-24-21:04:29 | 130.846 | 252.983 | 9.241 | 136.442 | 143.605 |
| 2020-07-24-21:04:35 | 130.803 | 251.719 | 8.305 | 135.442 | 144.873 |
| 2020-07-24-21:04:40 | 130.667 | 253.448 | 9.218 | 135.374 | 145.07 |
| 2020-07-24-21:04:46 | 131.17 | 252.047 | 9.676 | 135.473 | 145.139 |
| 2020-07-24-21:04:52 | 130.871 | 253.415 | 8.437 | 135.492 | 144.001 |
| 2020-07-24-21:04:57 | 130.449 | 251.528 | 8.434 | 135.679 | 144.167 |
| 2020-07-24-21:05:03 | 130.925 | 252.231 | 8.363 | 135.384 | 144.082 |
| 2020-07-24-21:05:09 | 130.664 | 251.74 | 7.962 | 135.079 | 143.46 |
| 2020-07-24-21:05:15 | 130.808 | 252.166 | 8.529 | 135.56 | 144.771 |
| 2020-07-24-21:05:20 | 130.803 | 251.557 | 8.417 | 135.588 | 144.695 |
| 2020-07-24-21:05:26 | 130.992 | 252.042 | 8.201 | 135.263 | 144.744 |
| 2020-07-24-21:05:32 | 130.562 | 252.413 | 8.136 | 135.718 | 144.581 |
| 2020-07-24-21:05:54 | 130.925 | 252.774 | 8.051 | 135.516 | 144.054 |
| 2020-07-24-21:06:00 | 130.637 | 251.573 | 8.363 | 135.289 | 144.155 |
| 2020-07-24-21:06:05 | 130.552 | 251.821 | 7.994 | 135.231 | 145.209 |
| 2020-07-24-21:06:11 | 130.966 | 253.443 | 7.951 | 135.548 | 145.043 |
| 2020-07-24-21:06:17 | 130.403 | 251.862 | 8.982 | 135.441 | 145.012 |
| 2020-07-24-21:06:23 | 131.072 | 252.106 | 8.008 | 134.991 | 143.999 |
| 2020-07-24-21:06:28 | 130.998 | 251.788 | 8.175 | 135.957 | 145.14 |
| 2020-07-24-21:06:34 | 130.785 | 251.692 | 7.914 | 135.56 | 143.889 |
| 2020-07-24-21:06:40 | 130.246 | 252.717 | 9.251 | 135.28 | 144.611 |
| 2020-07-24-21:06:45 | 131.22 | 252.325 | 8.613 | 135.613 | 143.891 |
| 2020-07-24-21:06:51 | 130.885 | 251.678 | 8.422 | 134.94 | 144.036 |
| 2020-07-24-21:06:57 | 130.724 | 251.652 | 9.668 | 135.573 | 145.118 |
| 2020-07-24-21:07:02 | 130.78 | 251.775 | 8.175 | 135.38 | 145.847 |
| 2020-07-24-21:07:08 | 130.744 | 251.852 | 8.983 | 135.591 | 145.039 |
| 2020-07-24-21:07:14 | 130.638 | 253.48 | 10.825 | 135.48 | 143.684 |
| 2020-07-24-21:07:20 | 130.695 | 251.745 | 8.349 | 135.01 | 143.889 |
| 2020-07-24-21:07:25 | 130.845 | 251.751 | 8.454 | 135.401 | 144.059 |
| 2020-07-24-21:07:31 | 130.57 | 251.413 | 8.082 | 135.169 | 143.834 |
| 2020-07-24-21:07:37 | 130.625 | 251.691 | 8.157 | 135.592 | 143.82 |
| 2020-07-24-21:07:42 | 130.735 | 253.996 | 8.206 | 134.995 | 144.948 |
| 2020-07-24-21:07:48 | 130.974 | 251.616 | 8.623 | 135.465 | 145.071 |
| 2020-07-24-21:07:54 | 131.129 | 251.739 | 8.324 | 135.899 | 144.602 |
| 2020-07-24-21:08:00 | 131.114 | 253.114 | 8.127 | 135.512 | 143.837 |
| 2020-07-24-21:08:05 | 130.714 | 253.69 | 9.608 | 135.273 | 143.696 |
| 2020-07-24-21:08:11 | 130.399 | 251.659 | 9.908 | 135.019 | 144.392 |
| 2020-07-24-21:08:17 | 130.889 | 252.319 | 8.4 | 135.306 | 143.811 |
| 2020-07-24-21:08:22 | 132.397 | 253.799 | 8.369 | 135.308 | 145.122 |
| 2020-07-24-21:08:28 | 138.12 | 251.542 | 8.331 | 135.274 | 146.857 |
| 2020-07-24-21:08:34 | 130.303 | 251.579 | 7.895 | 135.193 | 144.804 |
| 2020-07-24-21:08:39 | 130.393 | 252.005 | 8.52 | 135.282 | 144.798 |
| 2020-07-24-21:08:45 | 130.676 | 251.459 | 7.926 | 135.345 | 146.395 |
| 2020-07-24-21:08:51 | 131.735 | 251.66 | 8.271 | 137.16 | 148.943 |
| 2020-07-24-21:08:57 | 131.991 | 251.793 | 7.997 | 135.161 | 144.192 |
| 2020-07-24-21:09:02 | 131.346 | 251.832 | 8.405 | 135.575 | 144.31 |
| 2020-07-24-21:09:08 | 131.033 | 251.659 | 8.76 | 135.542 | 144.255 |
| 2020-07-24-21:09:14 | 130.49 | 247.254 | 8.323 | 135.444 | 143.837 |
| 2020-07-24-21:09:19 | 130.856 | 247.353 | 8.614 | 136.826 | 144.925 |
| 2020-07-24-21:09:25 | 130.449 | 247.256 | 8.436 | 135.624 | 145.074 |
| 2020-07-24-21:09:31 | 134.213 | 247.601 | 8.232 | 135.114 | 145.085 |
| 2020-07-24-21:09:36 | 131.173 | 247.961 | 8.193 | 135.527 | 146.495 |
| 2020-07-24-21:09:42 | 131.086 | 247.379 | 8.191 | 135.751 | 143.985 |
| 2020-07-24-21:09:48 | 130.521 | 247.161 | 8.009 | 134.979 | 145.953 |
| 2020-07-24-21:09:54 | 131.371 | 247.376 | 7.863 | 135.453 | 145.92 |
| 2020-07-24-21:09:59 | 130.816 | 247.505 | 8.539 | 135.46 | 144.098 |
| 2020-07-24-21:10:05 | 130.572 | 247.447 | 10.55 | 135.184 | 144.41 |
| 2020-07-24-21:10:11 | 130.545 | 247.87 | 9.429 | 135.409 | 144.393 |
| 2020-07-24-21:10:16 | 130.407 | 249.058 | 7.864 | 135.168 | 144.195 |
| 2020-07-24-21:10:22 | 130.864 | 246.973 | 8.15 | 135.113 | 143.837 |
| 2020-07-24-21:10:28 | 130.795 | 247.837 | 8.203 | 135.252 | 144.13 |
| 2020-07-24-21:10:34 | 132.633 | 247.895 | 8.173 | 135.672 | 144.299 |
| 2020-07-24-21:10:39 | 130.491 | 247.186 | 8.52 | 135.369 | 144.199 |
| 2020-07-24-21:10:45 | 130.731 | 247.323 | 7.848 | 135.04 | 144.442 |
| 2020-07-24-21:10:51 | 130.754 | 247.049 | 9.388 | 135.646 | 144.151 |
| 2020-07-24-21:10:56 | 131.044 | 247.461 | 8.537 | 135.106 | 144.088 |
| 2020-07-24-21:11:02 | 130.789 | 247.772 | 8.568 | 135.338 | 144.401 |
| 2020-07-24-21:11:08 | 130.593 | 248.432 | 8.446 | 135.233 | 144.576 |
| 2020-07-24-21:11:14 | 131.848 | 247.605 | 7.983 | 135.189 | 144.096 |
| 2020-07-24-21:11:19 | 131.012 | 247.616 | 8.347 | 135.215 | 144.009 |
| 2020-07-24-21:11:25 | 130.892 | 247.36 | 8.629 | 135.136 | 144.391 |
| 2020-07-24-21:11:31 | 130.854 | 251.09 | 8.377 | 134.965 | 144.118 |
| 2020-07-24-21:11:37 | 131.951 | 247.199 | 8.224 | 135.263 | 143.973 |
| 2020-07-24-21:11:43 | 130.77 | 247.389 | 8.038 | 135.113 | 146.389 |
| 2020-07-24-21:11:48 | 130.773 | 248.838 | 9.527 | 135.98 | 144.533 |
| 2020-07-24-21:11:54 | 130.818 | 247.648 | 9.403 | 135.108 | 145.089 |
| 2020-07-24-21:12:00 | 130.691 | 247.507 | 8.067 | 135.119 | 145.18 |
| 2020-07-24-21:12:05 | 130.951 | 246.935 | 10.508 | 135.662 | 145.056 |
| 2020-07-24-21:12:11 | 130.251 | 247.045 | 9.109 | 135.533 | 144.769 |
| 2020-07-24-21:12:17 | 130.924 | 247.546 | 8.014 | 135.044 | 145.001 |
| 2020-07-24-21:12:23 | 137.286 | 247.198 | 8.501 | 134.986 | 144.12 |
| 2020-07-24-21:12:28 | 130.826 | 247.298 | 9.899 | 135.431 | 144.275 |
| 2020-07-24-21:12:34 | 130.873 | 247.568 | 8.416 | 135.786 | 144.944 |
| 2020-07-24-21:12:40 | 130.72 | 247.111 | 8.469 | 135.128 | 145.166 |
| 2020-07-24-21:12:45 | 130.704 | 247.597 | 8.588 | 135.367 | 145.09 |
| 2020-07-24-21:12:51 | 131.09 | 247.421 | 8.301 | 135.307 | 143.953 |
| 2020-07-24-21:12:57 | 131.835 | 247.296 | 7.931 | 135.648 | 143.972 |
| 2020-07-24-21:13:03 | 131.343 | 247.485 | 8.98 | 135.162 | 143.866 |
| 2020-07-24-21:13:09 | 130.649 | 247.348 | 8.447 | 135.524 | 144.307 |
| 2020-07-24-21:13:14 | 130.59 | 247.474 | 8.453 | 135.08 | 144.246 |
| 2020-07-24-21:13:20 | 131.184 | 247.574 | 8.083 | 135.415 | 144.729 |
| 2020-07-24-21:13:26 | 130.289 | 247.016 | 8.686 | 137.604 | 144.545 |
| 2020-07-24-21:13:32 | 130.592 | 247.867 | 8.609 | 135.256 | 144.969 |
| 2020-07-24-21:13:37 | 130.628 | 247.389 | 8.467 | 135.447 | 144.014 |
| 2020-07-24-21:13:43 | 130.741 | 247.11 | 9.435 | 135.288 | 145.131 |
| 2020-07-24-21:13:49 | 131.552 | 249.601 | 8.93 | 135.257 | 146.002 |
| 2020-07-24-21:13:55 | 131.086 | 248.861 | 8.413 | 137.737 | 144.331 |
| 2020-07-24-21:14:00 | 130.581 | 247.467 | 8.302 | 135.011 | 144.291 |
| 2020-07-24-21:14:06 | 132.361 | 247.174 | 8.248 | 134.906 | 144.434 |
| 2020-07-24-21:14:12 | 130.609 | 247.751 | 8.224 | 135.264 | 145.204 |
| 2020-07-24-21:14:18 | 130.308 | 246.909 | 8.557 | 135.105 | 145.052 |
| 2020-07-24-21:14:23 | 130.696 | 247.271 | 8.724 | 135.236 | 144.735 |
| 2020-07-24-21:14:29 | 130.334 | 247.445 | 8.17 | 135.174 | 144.066 |
| 2020-07-24-21:14:35 | 130.316 | 247.221 | 8.986 | 135.14 | 144.325 |
| 2020-07-24-21:14:41 | 130.542 | 247.614 | 8.079 | 135.746 | 144.058 |
| 2020-07-24-21:14:51 | 130.719 | 247.505 | 8.367 | 136.166 | 144.419 |
| 2020-07-24-21:14:57 | 130.485 | 246.917 | 8.537 | 135.457 | 144.951 |
| 2020-07-24-21:15:03 | 130.648 | 252.136 | 8.113 | 135.645 | 145.115 |
| 2020-07-24-21:15:08 | 132.389 | 247.106 | 10.813 | 135.281 | 144.839 |
| 2020-07-24-21:15:14 | 130.785 | 247.601 | 9.062 | 135.044 | 144.014 |
| 2020-07-24-21:15:20 | 130.626 | 247.367 | 8.686 | 136.907 | 144.115 |
| 2020-07-24-21:15:26 | 131.083 | 247.748 | 8.268 | 135.146 | 144.042 |
| 2020-07-24-21:15:48 | 130.758 | 244.723 | 8.419 | 135.369 | 145.103 |
| 2020-07-24-21:15:55 | 130.489 | 244.758 | 8.855 | 135.372 | 145.044 |
| 2020-07-24-21:16:01 | 130.335 | 246.228 | 8.538 | 134.94 | 144.16 |
| 2020-07-24-21:16:06 | 130.437 | 244.591 | 8.281 | 135.227 | 143.823 |
| 2020-07-24-21:16:12 | 131.195 | 244.664 | 8.042 | 135.395 | 143.933 |
| 2020-07-24-21:16:18 | 131.371 | 246.144 | 8.204 | 135.22 | 144.098 |
| 2020-07-24-21:16:23 | 130.631 | 245.143 | 7.959 | 135.446 | 144.195 |
| 2020-07-24-21:16:29 | 132.156 | 244.481 | 8.666 | 135.09 | 144.799 |
| 2020-07-24-21:16:35 | 130.916 | 244.355 | 8.117 | 141.625 | 145.223 |
| 2020-07-24-21:16:41 | 130.779 | 244.625 | 8.51 | 135.723 | 144.72 |
| 2020-07-24-21:16:46 | 130.394 | 244.708 | 8.147 | 135.377 | 143.728 |
| 2020-07-24-21:16:52 | 131.449 | 244.807 | 8.462 | 135.543 | 143.959 |
| 2020-07-24-21:16:58 | 131.081 | 245.133 | 8.437 | 135.276 | 144.197 |
| 2020-07-24-21:17:03 | 130.775 | 244.846 | 8.7 | 135.112 | 144.146 |
| 2020-07-24-21:17:09 | 131.224 | 244.901 | 8.61 | 135.102 | 144.162 |
| 2020-07-24-21:17:15 | 130.84 | 245.136 | 8.401 | 134.828 | 144.037 |
| 2020-07-24-21:17:20 | 130.614 | 244.392 | 8.756 | 135.728 | 144.933 |
| 2020-07-24-21:17:26 | 130.45 | 244.473 | 8.042 | 135.422 | 145.556 |
| 2020-07-24-21:17:32 | 131.025 | 244.553 | 8.471 | 135.563 | 145.132 |
| 2020-07-24-21:17:38 | 130.86 | 250.051 | 10.188 | 135.702 | 143.808 |
| 2020-07-24-21:17:43 | 130.714 | 244.692 | 8.256 | 135.545 | 144.28 |
| 2020-07-24-21:17:49 | 130.261 | 244.634 | 8.183 | 135.189 | 143.893 |
| 2020-07-24-21:17:55 | 130.699 | 247.049 | 8.777 | 135.414 | 144.561 |
| 2020-07-24-21:18:00 | 130.362 | 244.836 | 8.764 | 136.938 | 144.582 |
| 2020-07-24-21:18:06 | 131.766 | 244.813 | 8.679 | 135.224 | 145.032 |